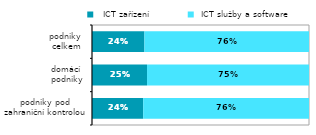
| Category |   ICT zařízení |  ICT služby a software |
|---|---|---|
| podniky pod
zahraniční kontrolou | 0.236 | 0.764 |
| domácí 
podniky | 0.254 | 0.746 |
| podniky 
celkem | 0.242 | 0.758 |